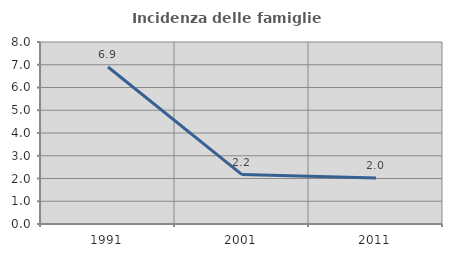
| Category | Incidenza delle famiglie numerose |
|---|---|
| 1991.0 | 6.9 |
| 2001.0 | 2.172 |
| 2011.0 | 2.021 |